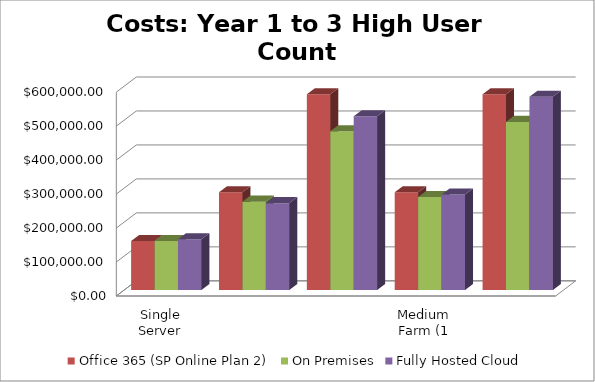
| Category | Office 365 (SP Online Plan 2) | On Premises | Fully Hosted Cloud |
|---|---|---|---|
| Single Server Install (WFE and SQL on 1 VM) | 144000 | 144041.62 | 149120 |
| Small Farm - Two Server Install (WFE and SQL) | 288000 | 260154.256 | 255760 |
| Small Farm w/ High Availability (2 WFE - 2 SQL) | 576000 | 467156.541 | 511700 |
| Medium Farm (1 WFE, 1 App/Index, 1 SQL) | 288000 | 273979.517 | 280960 |
| Medium Farm w/ High Availability (2 WFE, 2 A/I, 2 SQL) | 576000 | 494896.197 | 568940 |